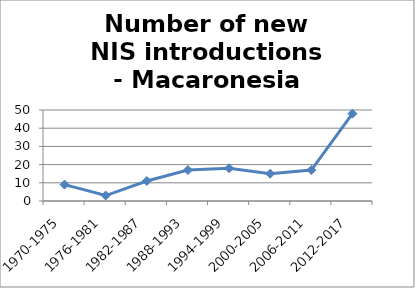
| Category | Number of new NIS introductions - Macaronesia |
|---|---|
| 1970-1975 | 9 |
| 1976-1981 | 3 |
| 1982-1987 | 11 |
| 1988-1993 | 17 |
| 1994-1999 | 18 |
| 2000-2005 | 15 |
| 2006-2011 | 17 |
| 2012-2017 | 48 |